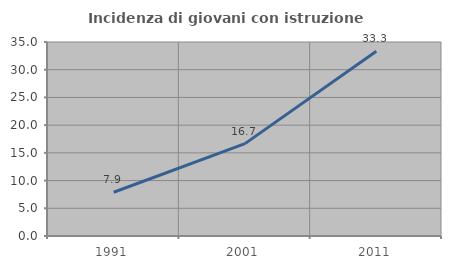
| Category | Incidenza di giovani con istruzione universitaria |
|---|---|
| 1991.0 | 7.895 |
| 2001.0 | 16.667 |
| 2011.0 | 33.333 |